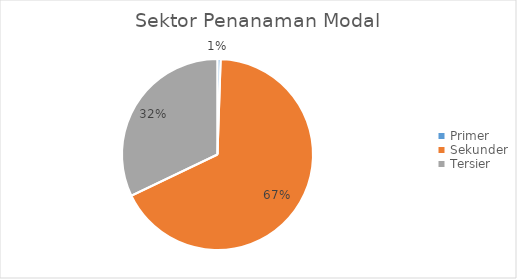
| Category | Series 0 |
|---|---|
| Primer | 0.53 |
| Sekunder | 67.37 |
| Tersier | 32.11 |